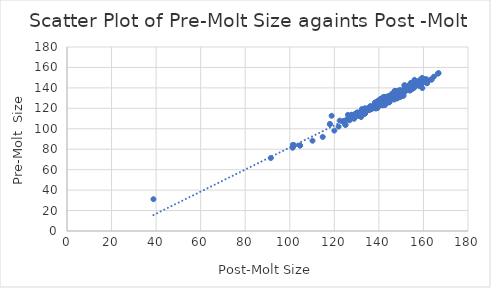
| Category | Pre-molt |
|---|---|
| 143.6 | 129.6 |
| 142.5 | 124.8 |
| 154.4 | 143.1 |
| 147.1 | 136.9 |
| 148.8 | 130.8 |
| 140.4 | 127.8 |
| 148.7 | 132.8 |
| 152.6 | 138.3 |
| 131.9 | 114.8 |
| 139.8 | 127 |
| 154.9 | 140.8 |
| 148.4 | 133.7 |
| 138.4 | 120.8 |
| 154.2 | 139.5 |
| 153.0 | 140.7 |
| 142.7 | 130.1 |
| 139.3 | 126.7 |
| 144.4 | 131 |
| 132.0 | 111.7 |
| 156.3 | 144.5 |
| 140.3 | 126.2 |
| 135.9 | 119.4 |
| 139.3 | 120.3 |
| 154.6 | 143.7 |
| 155.4 | 143 |
| 127.3 | 110.9 |
| 148.1 | 130.2 |
| 151.6 | 139.6 |
| 153.9 | 137.4 |
| 150.0 | 136.1 |
| 156.6 | 143.1 |
| 155.6 | 146 |
| 124.4 | 107.6 |
| 142.8 | 124.2 |
| 151.5 | 137.7 |
| 138.6 | 119.8 |
| 155.0 | 138.9 |
| 155.9 | 143.7 |
| 149.3 | 136 |
| 133.3 | 116.6 |
| 153.4 | 141.9 |
| 127.7 | 113.6 |
| 154.2 | 138.6 |
| 148.3 | 134.1 |
| 150.0 | 136.1 |
| 135.4 | 120.6 |
| 101.9 | 83.8 |
| 155.4 | 143 |
| 139.3 | 120.3 |
| 118.0 | 104.6 |
| 147.6 | 136.7 |
| 147.6 | 136.7 |
| 143.2 | 129.3 |
| 145.2 | 131.8 |
| 161.3 | 148.3 |
| 150.0 | 136.3 |
| 144.2 | 128.1 |
| 135.9 | 119.4 |
| 158.2 | 143.6 |
| 145.2 | 132.2 |
| 157.5 | 143 |
| 125.0 | 103.9 |
| 135.9 | 121.1 |
| 166.5 | 153.9 |
| 150.7 | 136.4 |
| 142.4 | 125.5 |
| 143.8 | 128.2 |
| 146.7 | 132.8 |
| 147.6 | 130.5 |
| 156.5 | 143.4 |
| 144.7 | 126.1 |
| 147.2 | 133.2 |
| 140.4 | 127.8 |
| 161.6 | 144.6 |
| 152.1 | 139.2 |
| 149.3 | 136.8 |
| 154.3 | 144.5 |
| 157.5 | 143 |
| 147.5 | 132.7 |
| 144.6 | 128.9 |
| 154.6 | 144.7 |
| 147.6 | 136.7 |
| 153.5 | 140.1 |
| 135.1 | 118.2 |
| 163.7 | 148.1 |
| 151.6 | 136.3 |
| 142.2 | 128.5 |
| 135.8 | 118.9 |
| 148.5 | 134.7 |
| 142.5 | 124.8 |
| 134.3 | 118.7 |
| 147.5 | 132.7 |
| 152.3 | 139.7 |
| 142.0 | 128.5 |
| 140.8 | 127.6 |
| 38.8 | 31.1 |
| 123.7 | 107.2 |
| 156.7 | 143.1 |
| 151.0 | 132.4 |
| 126.1 | 113.6 |
| 135.9 | 119.4 |
| 146.6 | 132.3 |
| 135.8 | 118.7 |
| 152.3 | 139.7 |
| 142.4 | 125.5 |
| 152.6 | 138.2 |
| 155.0 | 143.5 |
| 148.1 | 130.2 |
| 155.6 | 142.3 |
| 139.8 | 125.4 |
| 145.8 | 129.8 |
| 156.0 | 147.9 |
| 132.0 | 115.3 |
| 152.6 | 138.3 |
| 135.8 | 118.9 |
| 153.4 | 141.9 |
| 153.6 | 139 |
| 154.8 | 140.4 |
| 148.9 | 133 |
| 153.4 | 141.9 |
| 156.5 | 143.4 |
| 145.8 | 133.2 |
| 148.5 | 134.7 |
| 139.1 | 122.9 |
| 120.0 | 98.2 |
| 140.9 | 123.3 |
| 153.5 | 140.7 |
| 141.8 | 123.1 |
| 138.1 | 122.3 |
| 136.1 | 119.2 |
| 160.4 | 148.2 |
| 149.8 | 131.3 |
| 141.6 | 125.5 |
| 135.5 | 119.6 |
| 133.7 | 115 |
| 150.0 | 135.2 |
| 142.5 | 124.4 |
| 148.4 | 133.7 |
| 133.4 | 117.5 |
| 132.0 | 116.3 |
| 139.3 | 121.7 |
| 154.6 | 141.4 |
| 148.0 | 135.6 |
| 136.1 | 120.9 |
| 149.5 | 136.1 |
| 149.4 | 135.2 |
| 150.3 | 135.9 |
| 143.1 | 130.8 |
| 146.8 | 131.7 |
| 145.8 | 133.2 |
| 151.5 | 136.9 |
| 133.7 | 115 |
| 127.8 | 112.3 |
| 141.6 | 125.5 |
| 145.9 | 132.6 |
| 138.3 | 125.7 |
| 140.6 | 125.2 |
| 149.5 | 134.7 |
| 142.4 | 130.7 |
| 137.8 | 120.9 |
| 129.2 | 114.4 |
| 149.7 | 135.5 |
| 135.3 | 119.9 |
| 127.7 | 113.6 |
| 146.9 | 128.6 |
| 149.5 | 137.5 |
| 151.0 | 132.4 |
| 140.6 | 125.2 |
| 125.4 | 108.8 |
| 126.8 | 109.5 |
| 127.7 | 110.5 |
| 132.9 | 117.7 |
| 136.7 | 119.3 |
| 161.7 | 146.4 |
| 127.5 | 111 |
| 150.7 | 136.4 |
| 127.6 | 112.9 |
| 155.2 | 140.5 |
| 122.4 | 108 |
| 135.1 | 118.2 |
| 104.6 | 83.6 |
| 132.0 | 116.3 |
| 132.0 | 116.3 |
| 143.5 | 131.2 |
| 137.8 | 120.9 |
| 132.0 | 111.7 |
| 145.9 | 132.2 |
| 136.1 | 120.9 |
| 145.8 | 134.1 |
| 142.7 | 123.3 |
| 154.8 | 142.3 |
| 126.8 | 109.5 |
| 124.5 | 106.3 |
| 138.6 | 122.1 |
| 127.8 | 112.3 |
| 114.8 | 92 |
| 154.1 | 138.3 |
| 153.0 | 140.7 |
| 147.8 | 134.8 |
| 157.1 | 143 |
| 152.2 | 137.9 |
| 160.4 | 148.2 |
| 138.3 | 125.3 |
| 132.3 | 115.6 |
| 124.4 | 107.6 |
| 147.5 | 132.7 |
| 153.3 | 139.6 |
| 135.8 | 118.9 |
| 141.6 | 123 |
| 144.8 | 131.6 |
| 153.1 | 141.7 |
| 133.7 | 115 |
| 153.6 | 141.4 |
| 148.2 | 135.7 |
| 139.7 | 124.3 |
| 141.3 | 125 |
| 157.0 | 144.3 |
| 159.9 | 145.7 |
| 149.3 | 131.7 |
| 152.1 | 139.6 |
| 139.1 | 121.6 |
| 144.4 | 130.4 |
| 146.6 | 133.2 |
| 153.5 | 140.1 |
| 145.4 | 131 |
| 158.3 | 147.6 |
| 143.5 | 131.2 |
| 144.5 | 126 |
| 138.5 | 125 |
| 145.8 | 133.2 |
| 159.6 | 147.2 |
| 155.9 | 140.2 |
| 133.7 | 115 |
| 152.9 | 138 |
| 141.9 | 124.4 |
| 146.7 | 135 |
| 132.5 | 117.2 |
| 154.8 | 140.4 |
| 132.9 | 117.7 |
| 138.5 | 125 |
| 131.9 | 114.8 |
| 150.8 | 136.5 |
| 166.8 | 154.5 |
| 104.6 | 83.6 |
| 147.5 | 134.8 |
| 139.3 | 126.7 |
| 126.5 | 109.1 |
| 154.0 | 138 |
| 151.5 | 142.5 |
| 144.1 | 125.7 |
| 151.4 | 136.9 |
| 152.6 | 138.3 |
| 142.8 | 124.2 |
| 151.7 | 138.4 |
| 141.8 | 130.8 |
| 101.3 | 81.4 |
| 142.5 | 124.4 |
| 124.5 | 106.3 |
| 147.6 | 130.5 |
| 129.5 | 111.9 |
| 154.3 | 144.5 |
| 147.5 | 132.7 |
| 149.2 | 134.3 |
| 159.4 | 149.8 |
| 148.8 | 130.8 |
| 91.5 | 71.4 |
| 141.9 | 124.4 |
| 143.2 | 129.3 |
| 124.4 | 107.6 |
| 118.0 | 104.6 |
| 155.4 | 143 |
| 159.1 | 143.7 |
| 128.9 | 109.8 |
| 156.2 | 141.3 |
| 145.9 | 132.6 |
| 151.1 | 135.2 |
| 133.7 | 115 |
| 135.6 | 119 |
| 160.6 | 145.9 |
| 154.0 | 138 |
| 149.8 | 137.2 |
| 130.1 | 115.7 |
| 130.1 | 115.7 |
| 136.2 | 122.3 |
| 151.6 | 139.6 |
| 156.5 | 143.4 |
| 154.7 | 139.5 |
| 144.7 | 126.1 |
| 157.1 | 145.4 |
| 142.4 | 125.5 |
| 140.8 | 124.1 |
| 148.2 | 129.8 |
| 152.6 | 138.2 |
| 154.0 | 138 |
| 133.4 | 117.5 |
| 118.8 | 112.7 |
| 158.2 | 142 |
| 151.5 | 136.7 |
| 154.3 | 144.5 |
| 129.2 | 113.3 |
| 147.8 | 132.8 |
| 151.6 | 136.3 |
| 148.2 | 129.8 |
| 143.3 | 130 |
| 141.3 | 125 |
| 133.8 | 120.1 |
| 127.6 | 112.9 |
| 146.8 | 131.7 |
| 146.6 | 132.3 |
| 101.4 | 84.3 |
| 127.3 | 110.9 |
| 156.2 | 141.3 |
| 145.4 | 131 |
| 135.3 | 119.9 |
| 146.8 | 131.7 |
| 140.7 | 126.2 |
| 154.0 | 139.5 |
| 143.8 | 126 |
| 144.6 | 128.9 |
| 152.1 | 139.2 |
| 130.3 | 115.3 |
| 140.5 | 128.8 |
| 150.3 | 135.9 |
| 144.3 | 132 |
| 129.2 | 113.3 |
| 125.0 | 103.9 |
| 151.7 | 141 |
| 151.1 | 138.3 |
| 161.3 | 148.3 |
| 136.1 | 119.2 |
| 151.5 | 136.2 |
| 140.6 | 128.3 |
| 163.2 | 148.1 |
| 155.6 | 141.3 |
| 151.9 | 136.8 |
| 153.4 | 140 |
| 140.6 | 128.3 |
| 147.1 | 133.3 |
| 157.5 | 145.1 |
| 127.6 | 110.6 |
| 131.1 | 113.1 |
| 139.7 | 126.2 |
| 151.8 | 137.6 |
| 131.1 | 113.1 |
| 148.4 | 133.7 |
| 141.9 | 124.4 |
| 140.5 | 128.8 |
| 132.4 | 119.3 |
| 151.5 | 136.7 |
| 154.0 | 139.5 |
| 149.4 | 135.2 |
| 141.6 | 124.5 |
| 148.7 | 134.6 |
| 147.5 | 132.7 |
| 132.0 | 116.3 |
| 121.9 | 102.1 |
| 144.8 | 131.6 |
| 161.7 | 146.4 |
| 129.5 | 111.8 |
| 148.1 | 130.2 |
| 141.6 | 125.5 |
| 151.0 | 137.4 |
| 138.6 | 122.1 |
| 127.8 | 112.3 |
| 149.6 | 135.7 |
| 144.6 | 128.9 |
| 156.6 | 143.1 |
| 149.0 | 137.5 |
| 133.2 | 116.6 |
| 138.4 | 120.8 |
| 156.4 | 143.4 |
| 159.6 | 147.2 |
| 131.2 | 112.5 |
| 145.9 | 132.2 |
| 145.4 | 131 |
| 147.2 | 132.9 |
| 154.0 | 138 |
| 158.9 | 146.5 |
| 152.3 | 139.7 |
| 124.5 | 106.3 |
| 147.1 | 136.9 |
| 127.5 | 111 |
| 142.4 | 125.5 |
| 135.3 | 119.9 |
| 149.5 | 136.1 |
| 142.3 | 131 |
| 130.6 | 115.9 |
| 160.1 | 148 |
| 144.6 | 128.9 |
| 153.4 | 140 |
| 144.6 | 128.9 |
| 159.5 | 139.8 |
| 158.2 | 142 |
| 140.5 | 126.6 |
| 156.5 | 142.3 |
| 149.1 | 131.4 |
| 149.3 | 136 |
| 145.8 | 133.2 |
| 159.6 | 147.2 |
| 149.6 | 135.7 |
| 139.7 | 124.3 |
| 126.9 | 108.3 |
| 138.3 | 125.3 |
| 144.7 | 126.1 |
| 140.8 | 127.6 |
| 134.1 | 119.5 |
| 151.5 | 137.7 |
| 154.8 | 140.4 |
| 144.2 | 128.1 |
| 155.6 | 141.5 |
| 152.6 | 138.3 |
| 149.7 | 135.5 |
| 143.2 | 126.9 |
| 152.0 | 138.8 |
| 139.3 | 126.7 |
| 141.6 | 125.5 |
| 145.4 | 131 |
| 110.2 | 88.3 |
| 130.1 | 113.6 |
| 156.5 | 143.4 |
| 157.7 | 143.2 |
| 151.5 | 142.5 |
| 155.8 | 143.3 |
| 140.6 | 123.3 |
| 148.4 | 133.7 |
| 128.0 | 112.6 |
| 140.8 | 128.5 |
| 127.7 | 113.6 |
| 149.5 | 137.7 |
| 156.6 | 143.1 |
| 149.6 | 135.7 |
| 142.4 | 130.7 |
| 157.0 | 145.7 |
| 136.1 | 121.3 |
| 101.9 | 83.8 |
| 164.7 | 151 |
| 157.5 | 143 |
| 149.3 | 136 |
| 141.6 | 124.5 |
| 151.5 | 136.2 |
| 142.7 | 123.3 |
| 147.6 | 136.7 |
| 156.8 | 144.9 |
| 152.3 | 139.7 |
| 143.7 | 126.7 |
| 136.7 | 119.3 |
| 132.0 | 116.3 |
| 156.2 | 141.3 |
| 148.3 | 134.1 |
| 149.3 | 136.8 |
| 160.4 | 148.2 |
| 141.8 | 123.4 |
| 143.8 | 128.2 |
| 148.4 | 133.7 |
| 161.6 | 144.6 |